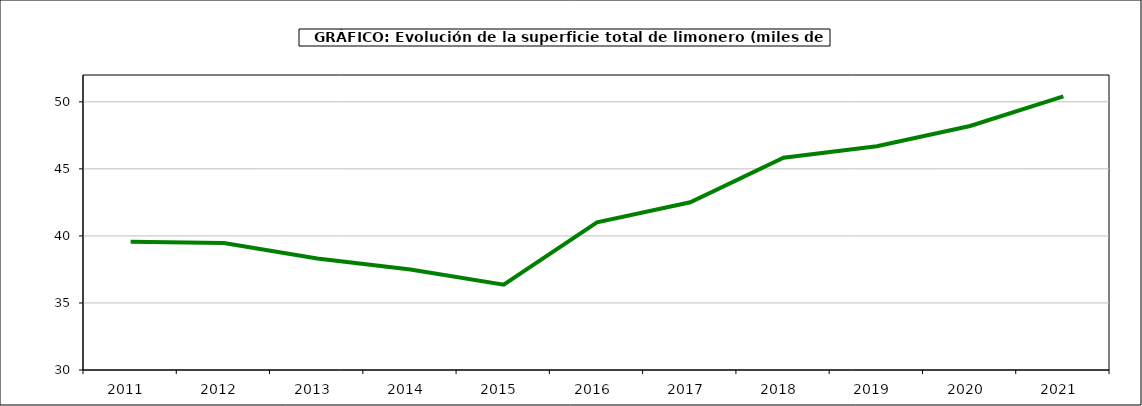
| Category | superficie |
|---|---|
| 2011.0 | 39.571 |
| 2012.0 | 39.463 |
| 2013.0 | 38.319 |
| 2014.0 | 37.498 |
| 2015.0 | 36.363 |
| 2016.0 | 41.009 |
| 2017.0 | 42.507 |
| 2018.0 | 45.832 |
| 2019.0 | 46.684 |
| 2020.0 | 48.196 |
| 2021.0 | 50.412 |